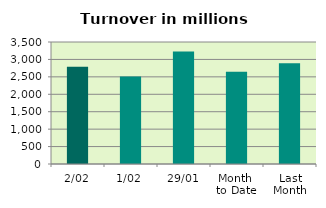
| Category | Series 0 |
|---|---|
| 2/02 | 2788.068 |
| 1/02 | 2507.238 |
| 29/01 | 3225.714 |
| Month 
to Date | 2647.653 |
| Last
Month | 2888.221 |